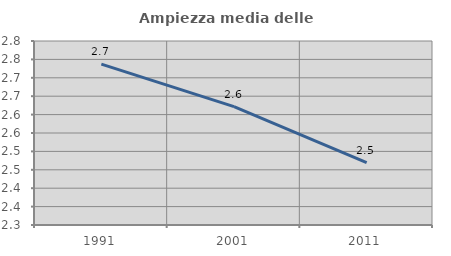
| Category | Ampiezza media delle famiglie |
|---|---|
| 1991.0 | 2.737 |
| 2001.0 | 2.622 |
| 2011.0 | 2.469 |